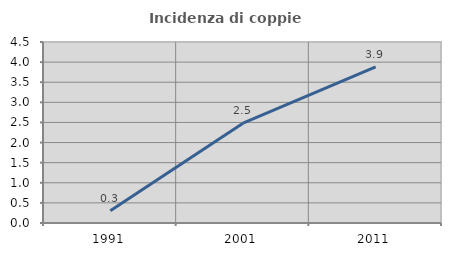
| Category | Incidenza di coppie miste |
|---|---|
| 1991.0 | 0.303 |
| 2001.0 | 2.482 |
| 2011.0 | 3.883 |